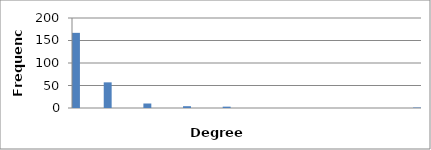
| Category | 167 |
|---|---|
| 1.0 | 167 |
| 1.2093023255813953 | 0 |
| 1.4186046511627906 | 0 |
| 1.6279069767441858 | 0 |
| 1.837209302325581 | 57 |
| 2.0465116279069764 | 0 |
| 2.2558139534883717 | 0 |
| 2.465116279069767 | 0 |
| 2.674418604651162 | 0 |
| 2.8837209302325575 | 10 |
| 3.0930232558139528 | 0 |
| 3.302325581395348 | 0 |
| 3.5116279069767433 | 0 |
| 3.7209302325581386 | 0 |
| 3.930232558139534 | 4 |
| 4.13953488372093 | 0 |
| 4.348837209302325 | 0 |
| 4.558139534883721 | 0 |
| 4.767441860465117 | 0 |
| 4.9767441860465125 | 3 |
| 5.186046511627908 | 0 |
| 5.395348837209304 | 0 |
| 5.6046511627907 | 0 |
| 5.813953488372095 | 0 |
| 6.023255813953491 | 0 |
| 6.232558139534887 | 0 |
| 6.4418604651162825 | 0 |
| 6.651162790697678 | 0 |
| 6.860465116279074 | 0 |
| 7.06976744186047 | 0 |
| 7.279069767441865 | 0 |
| 7.488372093023261 | 0 |
| 7.697674418604657 | 0 |
| 7.906976744186053 | 0 |
| 8.116279069767447 | 0 |
| 8.325581395348843 | 0 |
| 8.534883720930239 | 0 |
| 8.744186046511635 | 0 |
| 8.95348837209303 | 0 |
| 9.162790697674426 | 0 |
| 9.372093023255822 | 0 |
| 9.581395348837217 | 0 |
| 9.790697674418613 | 0 |
| 10.0 | 1 |